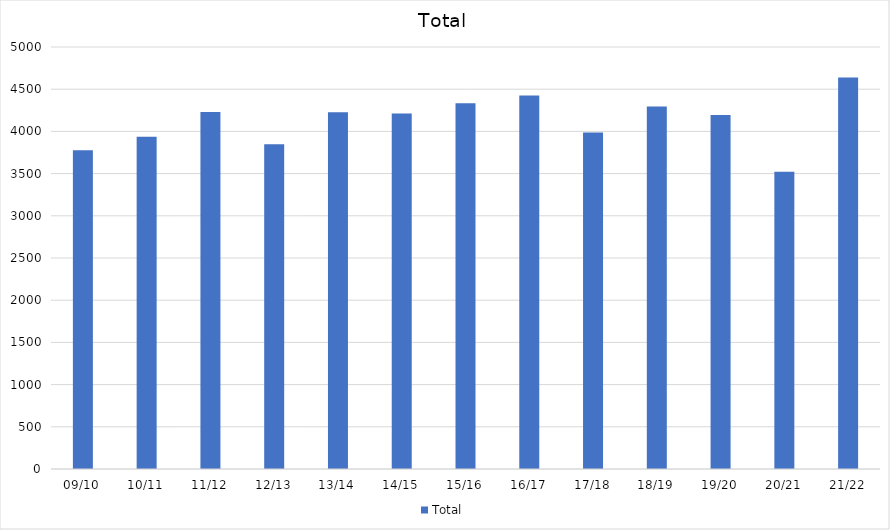
| Category | Total |
|---|---|
| 09/10 | 3778 |
| 10/11 | 3936 |
| 11/12 | 4230 |
| 12/13 | 3847 |
| 13/14 | 4228 |
| 14/15 | 4213 |
| 15/16 | 4333 |
| 16/17 | 4425 |
| 17/18 | 3988 |
| 18/19 | 4294 |
| 19/20 | 4194 |
| 20/21 | 3522 |
| 21/22 | 4640 |